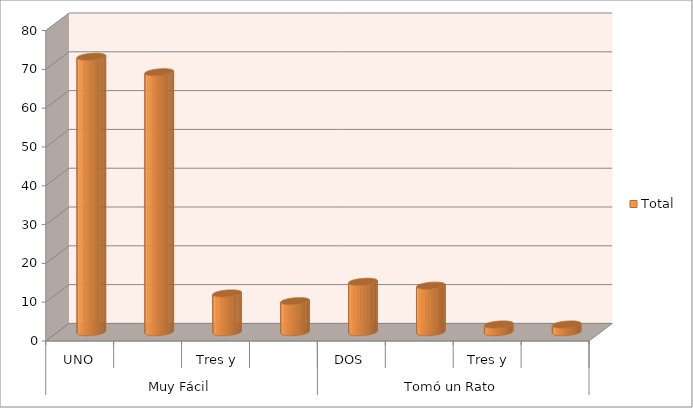
| Category | Total |
|---|---|
| 0 | 71 |
| 1 | 67 |
| 2 | 10 |
| 3 | 8 |
| 4 | 13 |
| 5 | 12 |
| 6 | 2 |
| 7 | 2 |